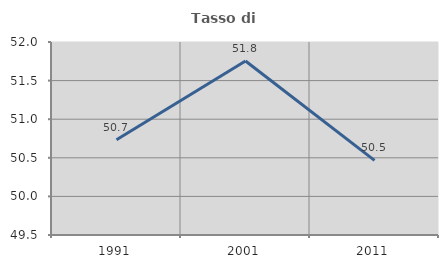
| Category | Tasso di occupazione   |
|---|---|
| 1991.0 | 50.733 |
| 2001.0 | 51.753 |
| 2011.0 | 50.467 |